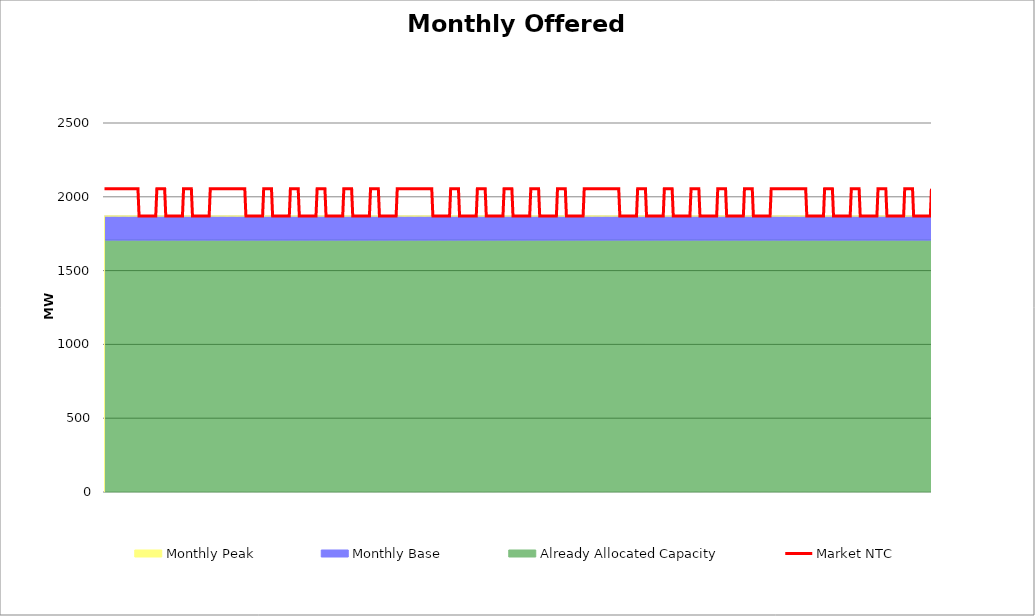
| Category | Market NTC |
|---|---|
| 0 | 2055 |
| 1 | 2055 |
| 2 | 2055 |
| 3 | 2055 |
| 4 | 2055 |
| 5 | 2055 |
| 6 | 2055 |
| 7 | 2055 |
| 8 | 2055 |
| 9 | 2055 |
| 10 | 2055 |
| 11 | 2055 |
| 12 | 2055 |
| 13 | 2055 |
| 14 | 2055 |
| 15 | 2055 |
| 16 | 2055 |
| 17 | 2055 |
| 18 | 2055 |
| 19 | 2055 |
| 20 | 2055 |
| 21 | 2055 |
| 22 | 2055 |
| 23 | 2055 |
| 24 | 2055 |
| 25 | 2055 |
| 26 | 2055 |
| 27 | 2055 |
| 28 | 2055 |
| 29 | 2055 |
| 30 | 2055 |
| 31 | 1870 |
| 32 | 1870 |
| 33 | 1870 |
| 34 | 1870 |
| 35 | 1870 |
| 36 | 1870 |
| 37 | 1870 |
| 38 | 1870 |
| 39 | 1870 |
| 40 | 1870 |
| 41 | 1870 |
| 42 | 1870 |
| 43 | 1870 |
| 44 | 1870 |
| 45 | 1870 |
| 46 | 1870 |
| 47 | 2055 |
| 48 | 2055 |
| 49 | 2055 |
| 50 | 2055 |
| 51 | 2055 |
| 52 | 2055 |
| 53 | 2055 |
| 54 | 2055 |
| 55 | 1870 |
| 56 | 1870 |
| 57 | 1870 |
| 58 | 1870 |
| 59 | 1870 |
| 60 | 1870 |
| 61 | 1870 |
| 62 | 1870 |
| 63 | 1870 |
| 64 | 1870 |
| 65 | 1870 |
| 66 | 1870 |
| 67 | 1870 |
| 68 | 1870 |
| 69 | 1870 |
| 70 | 1870 |
| 71 | 2055 |
| 72 | 2055 |
| 73 | 2055 |
| 74 | 2055 |
| 75 | 2055 |
| 76 | 2055 |
| 77 | 2055 |
| 78 | 2055 |
| 79 | 1870 |
| 80 | 1870 |
| 81 | 1870 |
| 82 | 1870 |
| 83 | 1870 |
| 84 | 1870 |
| 85 | 1870 |
| 86 | 1870 |
| 87 | 1870 |
| 88 | 1870 |
| 89 | 1870 |
| 90 | 1870 |
| 91 | 1870 |
| 92 | 1870 |
| 93 | 1870 |
| 94 | 1870 |
| 95 | 2055 |
| 96 | 2055 |
| 97 | 2055 |
| 98 | 2055 |
| 99 | 2055 |
| 100 | 2055 |
| 101 | 2055 |
| 102 | 2055 |
| 103 | 2055 |
| 104 | 2055 |
| 105 | 2055 |
| 106 | 2055 |
| 107 | 2055 |
| 108 | 2055 |
| 109 | 2055 |
| 110 | 2055 |
| 111 | 2055 |
| 112 | 2055 |
| 113 | 2055 |
| 114 | 2055 |
| 115 | 2055 |
| 116 | 2055 |
| 117 | 2055 |
| 118 | 2055 |
| 119 | 2055 |
| 120 | 2055 |
| 121 | 2055 |
| 122 | 2055 |
| 123 | 2055 |
| 124 | 2055 |
| 125 | 2055 |
| 126 | 2055 |
| 127 | 1870 |
| 128 | 1870 |
| 129 | 1870 |
| 130 | 1870 |
| 131 | 1870 |
| 132 | 1870 |
| 133 | 1870 |
| 134 | 1870 |
| 135 | 1870 |
| 136 | 1870 |
| 137 | 1870 |
| 138 | 1870 |
| 139 | 1870 |
| 140 | 1870 |
| 141 | 1870 |
| 142 | 1870 |
| 143 | 2055 |
| 144 | 2055 |
| 145 | 2055 |
| 146 | 2055 |
| 147 | 2055 |
| 148 | 2055 |
| 149 | 2055 |
| 150 | 2055 |
| 151 | 1870 |
| 152 | 1870 |
| 153 | 1870 |
| 154 | 1870 |
| 155 | 1870 |
| 156 | 1870 |
| 157 | 1870 |
| 158 | 1870 |
| 159 | 1870 |
| 160 | 1870 |
| 161 | 1870 |
| 162 | 1870 |
| 163 | 1870 |
| 164 | 1870 |
| 165 | 1870 |
| 166 | 1870 |
| 167 | 2055 |
| 168 | 2055 |
| 169 | 2055 |
| 170 | 2055 |
| 171 | 2055 |
| 172 | 2055 |
| 173 | 2055 |
| 174 | 2055 |
| 175 | 1870 |
| 176 | 1870 |
| 177 | 1870 |
| 178 | 1870 |
| 179 | 1870 |
| 180 | 1870 |
| 181 | 1870 |
| 182 | 1870 |
| 183 | 1870 |
| 184 | 1870 |
| 185 | 1870 |
| 186 | 1870 |
| 187 | 1870 |
| 188 | 1870 |
| 189 | 1870 |
| 190 | 1870 |
| 191 | 2055 |
| 192 | 2055 |
| 193 | 2055 |
| 194 | 2055 |
| 195 | 2055 |
| 196 | 2055 |
| 197 | 2055 |
| 198 | 2055 |
| 199 | 1870 |
| 200 | 1870 |
| 201 | 1870 |
| 202 | 1870 |
| 203 | 1870 |
| 204 | 1870 |
| 205 | 1870 |
| 206 | 1870 |
| 207 | 1870 |
| 208 | 1870 |
| 209 | 1870 |
| 210 | 1870 |
| 211 | 1870 |
| 212 | 1870 |
| 213 | 1870 |
| 214 | 1870 |
| 215 | 2055 |
| 216 | 2055 |
| 217 | 2055 |
| 218 | 2055 |
| 219 | 2055 |
| 220 | 2055 |
| 221 | 2055 |
| 222 | 2055 |
| 223 | 1870 |
| 224 | 1870 |
| 225 | 1870 |
| 226 | 1870 |
| 227 | 1870 |
| 228 | 1870 |
| 229 | 1870 |
| 230 | 1870 |
| 231 | 1870 |
| 232 | 1870 |
| 233 | 1870 |
| 234 | 1870 |
| 235 | 1870 |
| 236 | 1870 |
| 237 | 1870 |
| 238 | 1870 |
| 239 | 2055 |
| 240 | 2055 |
| 241 | 2055 |
| 242 | 2055 |
| 243 | 2055 |
| 244 | 2055 |
| 245 | 2055 |
| 246 | 2055 |
| 247 | 1870 |
| 248 | 1870 |
| 249 | 1870 |
| 250 | 1870 |
| 251 | 1870 |
| 252 | 1870 |
| 253 | 1870 |
| 254 | 1870 |
| 255 | 1870 |
| 256 | 1870 |
| 257 | 1870 |
| 258 | 1870 |
| 259 | 1870 |
| 260 | 1870 |
| 261 | 1870 |
| 262 | 1870 |
| 263 | 2055 |
| 264 | 2055 |
| 265 | 2055 |
| 266 | 2055 |
| 267 | 2055 |
| 268 | 2055 |
| 269 | 2055 |
| 270 | 2055 |
| 271 | 2055 |
| 272 | 2055 |
| 273 | 2055 |
| 274 | 2055 |
| 275 | 2055 |
| 276 | 2055 |
| 277 | 2055 |
| 278 | 2055 |
| 279 | 2055 |
| 280 | 2055 |
| 281 | 2055 |
| 282 | 2055 |
| 283 | 2055 |
| 284 | 2055 |
| 285 | 2055 |
| 286 | 2055 |
| 287 | 2055 |
| 288 | 2055 |
| 289 | 2055 |
| 290 | 2055 |
| 291 | 2055 |
| 292 | 2055 |
| 293 | 2055 |
| 294 | 2055 |
| 295 | 1870 |
| 296 | 1870 |
| 297 | 1870 |
| 298 | 1870 |
| 299 | 1870 |
| 300 | 1870 |
| 301 | 1870 |
| 302 | 1870 |
| 303 | 1870 |
| 304 | 1870 |
| 305 | 1870 |
| 306 | 1870 |
| 307 | 1870 |
| 308 | 1870 |
| 309 | 1870 |
| 310 | 1870 |
| 311 | 2055 |
| 312 | 2055 |
| 313 | 2055 |
| 314 | 2055 |
| 315 | 2055 |
| 316 | 2055 |
| 317 | 2055 |
| 318 | 2055 |
| 319 | 1870 |
| 320 | 1870 |
| 321 | 1870 |
| 322 | 1870 |
| 323 | 1870 |
| 324 | 1870 |
| 325 | 1870 |
| 326 | 1870 |
| 327 | 1870 |
| 328 | 1870 |
| 329 | 1870 |
| 330 | 1870 |
| 331 | 1870 |
| 332 | 1870 |
| 333 | 1870 |
| 334 | 1870 |
| 335 | 2055 |
| 336 | 2055 |
| 337 | 2055 |
| 338 | 2055 |
| 339 | 2055 |
| 340 | 2055 |
| 341 | 2055 |
| 342 | 2055 |
| 343 | 1870 |
| 344 | 1870 |
| 345 | 1870 |
| 346 | 1870 |
| 347 | 1870 |
| 348 | 1870 |
| 349 | 1870 |
| 350 | 1870 |
| 351 | 1870 |
| 352 | 1870 |
| 353 | 1870 |
| 354 | 1870 |
| 355 | 1870 |
| 356 | 1870 |
| 357 | 1870 |
| 358 | 1870 |
| 359 | 2055 |
| 360 | 2055 |
| 361 | 2055 |
| 362 | 2055 |
| 363 | 2055 |
| 364 | 2055 |
| 365 | 2055 |
| 366 | 2055 |
| 367 | 1870 |
| 368 | 1870 |
| 369 | 1870 |
| 370 | 1870 |
| 371 | 1870 |
| 372 | 1870 |
| 373 | 1870 |
| 374 | 1870 |
| 375 | 1870 |
| 376 | 1870 |
| 377 | 1870 |
| 378 | 1870 |
| 379 | 1870 |
| 380 | 1870 |
| 381 | 1870 |
| 382 | 1870 |
| 383 | 2055 |
| 384 | 2055 |
| 385 | 2055 |
| 386 | 2055 |
| 387 | 2055 |
| 388 | 2055 |
| 389 | 2055 |
| 390 | 2055 |
| 391 | 1870 |
| 392 | 1870 |
| 393 | 1870 |
| 394 | 1870 |
| 395 | 1870 |
| 396 | 1870 |
| 397 | 1870 |
| 398 | 1870 |
| 399 | 1870 |
| 400 | 1870 |
| 401 | 1870 |
| 402 | 1870 |
| 403 | 1870 |
| 404 | 1870 |
| 405 | 1870 |
| 406 | 1870 |
| 407 | 2055 |
| 408 | 2055 |
| 409 | 2055 |
| 410 | 2055 |
| 411 | 2055 |
| 412 | 2055 |
| 413 | 2055 |
| 414 | 2055 |
| 415 | 1870 |
| 416 | 1870 |
| 417 | 1870 |
| 418 | 1870 |
| 419 | 1870 |
| 420 | 1870 |
| 421 | 1870 |
| 422 | 1870 |
| 423 | 1870 |
| 424 | 1870 |
| 425 | 1870 |
| 426 | 1870 |
| 427 | 1870 |
| 428 | 1870 |
| 429 | 1870 |
| 430 | 1870 |
| 431 | 2055 |
| 432 | 2055 |
| 433 | 2055 |
| 434 | 2055 |
| 435 | 2055 |
| 436 | 2055 |
| 437 | 2055 |
| 438 | 2055 |
| 439 | 2055 |
| 440 | 2055 |
| 441 | 2055 |
| 442 | 2055 |
| 443 | 2055 |
| 444 | 2055 |
| 445 | 2055 |
| 446 | 2055 |
| 447 | 2055 |
| 448 | 2055 |
| 449 | 2055 |
| 450 | 2055 |
| 451 | 2055 |
| 452 | 2055 |
| 453 | 2055 |
| 454 | 2055 |
| 455 | 2055 |
| 456 | 2055 |
| 457 | 2055 |
| 458 | 2055 |
| 459 | 2055 |
| 460 | 2055 |
| 461 | 2055 |
| 462 | 2055 |
| 463 | 1870 |
| 464 | 1870 |
| 465 | 1870 |
| 466 | 1870 |
| 467 | 1870 |
| 468 | 1870 |
| 469 | 1870 |
| 470 | 1870 |
| 471 | 1870 |
| 472 | 1870 |
| 473 | 1870 |
| 474 | 1870 |
| 475 | 1870 |
| 476 | 1870 |
| 477 | 1870 |
| 478 | 1870 |
| 479 | 2055 |
| 480 | 2055 |
| 481 | 2055 |
| 482 | 2055 |
| 483 | 2055 |
| 484 | 2055 |
| 485 | 2055 |
| 486 | 2055 |
| 487 | 1870 |
| 488 | 1870 |
| 489 | 1870 |
| 490 | 1870 |
| 491 | 1870 |
| 492 | 1870 |
| 493 | 1870 |
| 494 | 1870 |
| 495 | 1870 |
| 496 | 1870 |
| 497 | 1870 |
| 498 | 1870 |
| 499 | 1870 |
| 500 | 1870 |
| 501 | 1870 |
| 502 | 1870 |
| 503 | 2055 |
| 504 | 2055 |
| 505 | 2055 |
| 506 | 2055 |
| 507 | 2055 |
| 508 | 2055 |
| 509 | 2055 |
| 510 | 2055 |
| 511 | 1870 |
| 512 | 1870 |
| 513 | 1870 |
| 514 | 1870 |
| 515 | 1870 |
| 516 | 1870 |
| 517 | 1870 |
| 518 | 1870 |
| 519 | 1870 |
| 520 | 1870 |
| 521 | 1870 |
| 522 | 1870 |
| 523 | 1870 |
| 524 | 1870 |
| 525 | 1870 |
| 526 | 1870 |
| 527 | 2055 |
| 528 | 2055 |
| 529 | 2055 |
| 530 | 2055 |
| 531 | 2055 |
| 532 | 2055 |
| 533 | 2055 |
| 534 | 2055 |
| 535 | 1870 |
| 536 | 1870 |
| 537 | 1870 |
| 538 | 1870 |
| 539 | 1870 |
| 540 | 1870 |
| 541 | 1870 |
| 542 | 1870 |
| 543 | 1870 |
| 544 | 1870 |
| 545 | 1870 |
| 546 | 1870 |
| 547 | 1870 |
| 548 | 1870 |
| 549 | 1870 |
| 550 | 1870 |
| 551 | 2055 |
| 552 | 2055 |
| 553 | 2055 |
| 554 | 2055 |
| 555 | 2055 |
| 556 | 2055 |
| 557 | 2055 |
| 558 | 2055 |
| 559 | 1870 |
| 560 | 1870 |
| 561 | 1870 |
| 562 | 1870 |
| 563 | 1870 |
| 564 | 1870 |
| 565 | 1870 |
| 566 | 1870 |
| 567 | 1870 |
| 568 | 1870 |
| 569 | 1870 |
| 570 | 1870 |
| 571 | 1870 |
| 572 | 1870 |
| 573 | 1870 |
| 574 | 1870 |
| 575 | 2055 |
| 576 | 2055 |
| 577 | 2055 |
| 578 | 2055 |
| 579 | 2055 |
| 580 | 2055 |
| 581 | 2055 |
| 582 | 2055 |
| 583 | 1870 |
| 584 | 1870 |
| 585 | 1870 |
| 586 | 1870 |
| 587 | 1870 |
| 588 | 1870 |
| 589 | 1870 |
| 590 | 1870 |
| 591 | 1870 |
| 592 | 1870 |
| 593 | 1870 |
| 594 | 1870 |
| 595 | 1870 |
| 596 | 1870 |
| 597 | 1870 |
| 598 | 1870 |
| 599 | 2055 |
| 600 | 2055 |
| 601 | 2055 |
| 602 | 2055 |
| 603 | 2055 |
| 604 | 2055 |
| 605 | 2055 |
| 606 | 2055 |
| 607 | 2055 |
| 608 | 2055 |
| 609 | 2055 |
| 610 | 2055 |
| 611 | 2055 |
| 612 | 2055 |
| 613 | 2055 |
| 614 | 2055 |
| 615 | 2055 |
| 616 | 2055 |
| 617 | 2055 |
| 618 | 2055 |
| 619 | 2055 |
| 620 | 2055 |
| 621 | 2055 |
| 622 | 2055 |
| 623 | 2055 |
| 624 | 2055 |
| 625 | 2055 |
| 626 | 2055 |
| 627 | 2055 |
| 628 | 2055 |
| 629 | 2055 |
| 630 | 2055 |
| 631 | 1870 |
| 632 | 1870 |
| 633 | 1870 |
| 634 | 1870 |
| 635 | 1870 |
| 636 | 1870 |
| 637 | 1870 |
| 638 | 1870 |
| 639 | 1870 |
| 640 | 1870 |
| 641 | 1870 |
| 642 | 1870 |
| 643 | 1870 |
| 644 | 1870 |
| 645 | 1870 |
| 646 | 1870 |
| 647 | 2055 |
| 648 | 2055 |
| 649 | 2055 |
| 650 | 2055 |
| 651 | 2055 |
| 652 | 2055 |
| 653 | 2055 |
| 654 | 2055 |
| 655 | 1870 |
| 656 | 1870 |
| 657 | 1870 |
| 658 | 1870 |
| 659 | 1870 |
| 660 | 1870 |
| 661 | 1870 |
| 662 | 1870 |
| 663 | 1870 |
| 664 | 1870 |
| 665 | 1870 |
| 666 | 1870 |
| 667 | 1870 |
| 668 | 1870 |
| 669 | 1870 |
| 670 | 1870 |
| 671 | 2055 |
| 672 | 2055 |
| 673 | 2055 |
| 674 | 2055 |
| 675 | 2055 |
| 676 | 2055 |
| 677 | 2055 |
| 678 | 2055 |
| 679 | 1870 |
| 680 | 1870 |
| 681 | 1870 |
| 682 | 1870 |
| 683 | 1870 |
| 684 | 1870 |
| 685 | 1870 |
| 686 | 1870 |
| 687 | 1870 |
| 688 | 1870 |
| 689 | 1870 |
| 690 | 1870 |
| 691 | 1870 |
| 692 | 1870 |
| 693 | 1870 |
| 694 | 1870 |
| 695 | 2055 |
| 696 | 2055 |
| 697 | 2055 |
| 698 | 2055 |
| 699 | 2055 |
| 700 | 2055 |
| 701 | 2055 |
| 702 | 2055 |
| 703 | 1870 |
| 704 | 1870 |
| 705 | 1870 |
| 706 | 1870 |
| 707 | 1870 |
| 708 | 1870 |
| 709 | 1870 |
| 710 | 1870 |
| 711 | 1870 |
| 712 | 1870 |
| 713 | 1870 |
| 714 | 1870 |
| 715 | 1870 |
| 716 | 1870 |
| 717 | 1870 |
| 718 | 1870 |
| 719 | 2055 |
| 720 | 2055 |
| 721 | 2055 |
| 722 | 2055 |
| 723 | 2055 |
| 724 | 2055 |
| 725 | 2055 |
| 726 | 2055 |
| 727 | 1870 |
| 728 | 1870 |
| 729 | 1870 |
| 730 | 1870 |
| 731 | 1870 |
| 732 | 1870 |
| 733 | 1870 |
| 734 | 1870 |
| 735 | 1870 |
| 736 | 1870 |
| 737 | 1870 |
| 738 | 1870 |
| 739 | 1870 |
| 740 | 1870 |
| 741 | 1870 |
| 742 | 1870 |
| 743 | 2055 |